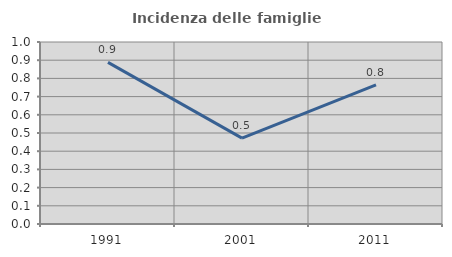
| Category | Incidenza delle famiglie numerose |
|---|---|
| 1991.0 | 0.888 |
| 2001.0 | 0.472 |
| 2011.0 | 0.765 |